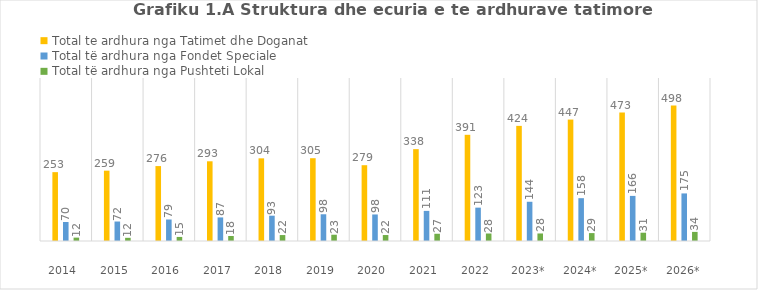
| Category | Total te ardhura nga Tatimet dhe Doganat | Total të ardhura nga Fondet Speciale | Total të ardhura nga Pushteti Lokal |
|---|---|---|---|
| 2014  | 253.413 | 70.008 | 12.447 |
| 2015  | 258.882 | 71.726 | 11.7 |
| 2016  | 275.78 | 79.153 | 14.951 |
| 2017  | 293.386 | 86.795 | 18.447 |
| 2018  | 304.318 | 93.153 | 21.863 |
| 2019  | 304.758 | 98.411 | 23.102 |
| 2020  | 278.99 | 97.699 | 21.975 |
| 2021  | 338.1 | 110.87 | 26.666 |
| 2022  | 390.9 | 122.8 | 27.6 |
| 2023* | 423.8 | 144.4 | 27.74 |
| 2024* | 447 | 157.63 | 29.11 |
| 2025* | 472.8 | 166 | 30.52 |
| 2026* | 498.4 | 175.12 | 33.53 |